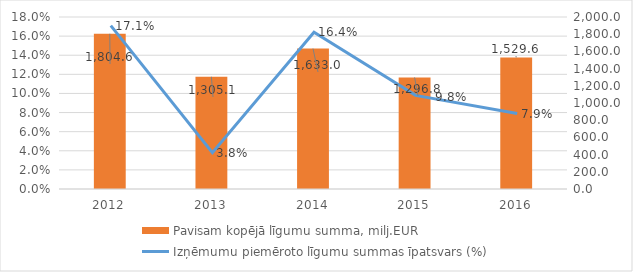
| Category | Pavisam kopējā līgumu summa, milj.EUR |
|---|---|
| 2012.0 | 1804.591 |
| 2013.0 | 1305.116 |
| 2014.0 | 1632.977 |
| 2015.0 | 1296.767 |
| 2016.0 | 1529.6 |